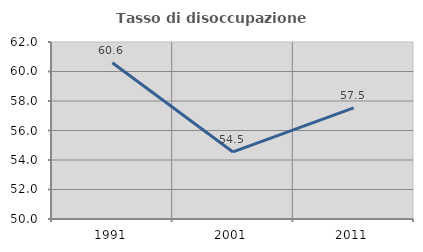
| Category | Tasso di disoccupazione giovanile  |
|---|---|
| 1991.0 | 60.593 |
| 2001.0 | 54.545 |
| 2011.0 | 57.534 |